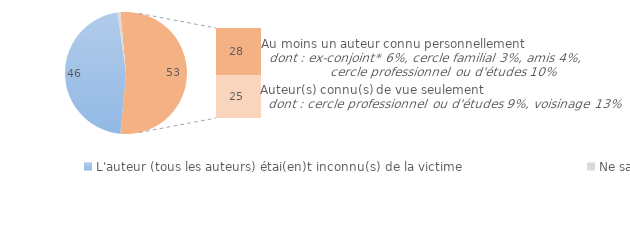
| Category | Series 0 |
|---|---|
| L'auteur (tous les auteurs) étai(en)t inconnu(s) de la victime | 46.336 |
| Ne sait pas/Refus | 0.783 |
| L'auteur (au moins un auteur) était connu de vue ou personnellement  | 28 |